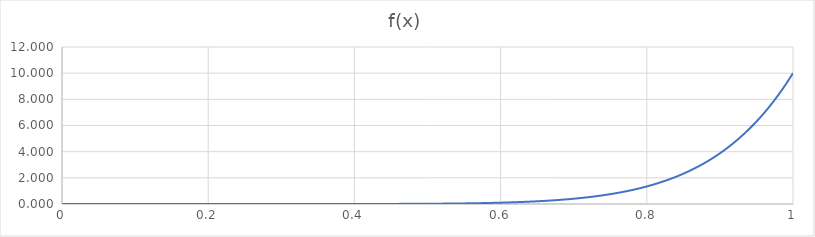
| Category | Series 0 |
|---|---|
| 0.0 | 0 |
| 0.01 | 0 |
| 0.02 | 0 |
| 0.03 | 0 |
| 0.04 | 0 |
| 0.05 | 0 |
| 0.06 | 0 |
| 0.07 | 0 |
| 0.08 | 0 |
| 0.09 | 0 |
| 0.1 | 0 |
| 0.11 | 0 |
| 0.12 | 0 |
| 0.13 | 0 |
| 0.14 | 0 |
| 0.15 | 0 |
| 0.16 | 0 |
| 0.17 | 0 |
| 0.18 | 0 |
| 0.19 | 0 |
| 0.2 | 0 |
| 0.21 | 0 |
| 0.22 | 0 |
| 0.23 | 0 |
| 0.24 | 0 |
| 0.25 | 0 |
| 0.26 | 0 |
| 0.27 | 0 |
| 0.28 | 0 |
| 0.29 | 0 |
| 0.3 | 0 |
| 0.31 | 0 |
| 0.32 | 0 |
| 0.33 | 0 |
| 0.34 | 0.001 |
| 0.35 | 0.001 |
| 0.36 | 0.001 |
| 0.37 | 0.001 |
| 0.38 | 0.002 |
| 0.39 | 0.002 |
| 0.4 | 0.003 |
| 0.41 | 0.003 |
| 0.42 | 0.004 |
| 0.43 | 0.005 |
| 0.44 | 0.006 |
| 0.45 | 0.008 |
| 0.46 | 0.009 |
| 0.47 | 0.011 |
| 0.48 | 0.014 |
| 0.49 | 0.016 |
| 0.5 | 0.02 |
| 0.51 | 0.023 |
| 0.52 | 0.028 |
| 0.53 | 0.033 |
| 0.54 | 0.039 |
| 0.55 | 0.046 |
| 0.56 | 0.054 |
| 0.57 | 0.064 |
| 0.58 | 0.074 |
| 0.59 | 0.087 |
| 0.6 | 0.101 |
| 0.61 | 0.117 |
| 0.62 | 0.135 |
| 0.63 | 0.156 |
| 0.64 | 0.18 |
| 0.65 | 0.207 |
| 0.66 | 0.238 |
| 0.67 | 0.272 |
| 0.68 | 0.311 |
| 0.69 | 0.355 |
| 0.7 | 0.404 |
| 0.71 | 0.458 |
| 0.72 | 0.52 |
| 0.73 | 0.589 |
| 0.74 | 0.665 |
| 0.75 | 0.751 |
| 0.76 | 0.846 |
| 0.77 | 0.952 |
| 0.78 | 1.069 |
| 0.79 | 1.199 |
| 0.8 | 1.342 |
| 0.81 | 1.501 |
| 0.82 | 1.676 |
| 0.83 | 1.869 |
| 0.84 | 2.082 |
| 0.85 | 2.316 |
| 0.86 | 2.573 |
| 0.87 | 2.855 |
| 0.88 | 3.165 |
| 0.89 | 3.504 |
| 0.9 | 3.874 |
| 0.91 | 4.279 |
| 0.92 | 4.722 |
| 0.93 | 5.204 |
| 0.94 | 5.73 |
| 0.95 | 6.302 |
| 0.96 | 6.925 |
| 0.97 | 7.602 |
| 0.98 | 8.337 |
| 0.99 | 9.135 |
| 1.0 | 10 |